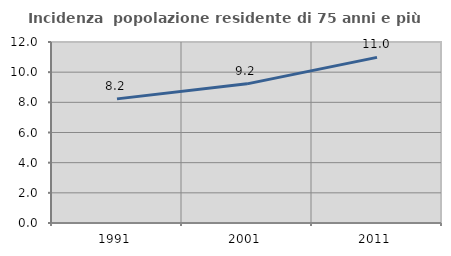
| Category | Incidenza  popolazione residente di 75 anni e più |
|---|---|
| 1991.0 | 8.229 |
| 2001.0 | 9.225 |
| 2011.0 | 10.982 |